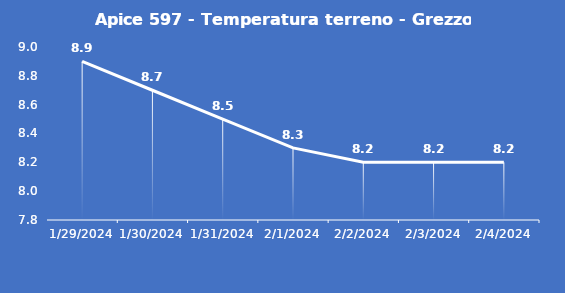
| Category | Apice 597 - Temperatura terreno - Grezzo (°C) |
|---|---|
| 1/29/24 | 8.9 |
| 1/30/24 | 8.7 |
| 1/31/24 | 8.5 |
| 2/1/24 | 8.3 |
| 2/2/24 | 8.2 |
| 2/3/24 | 8.2 |
| 2/4/24 | 8.2 |